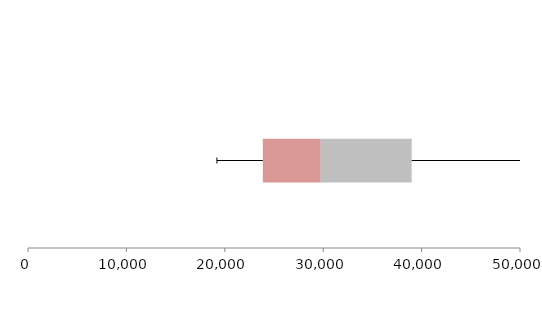
| Category | Series 1 | Series 2 | Series 3 |
|---|---|---|---|
| 0 | 23866.607 | 5885.318 | 9239.914 |